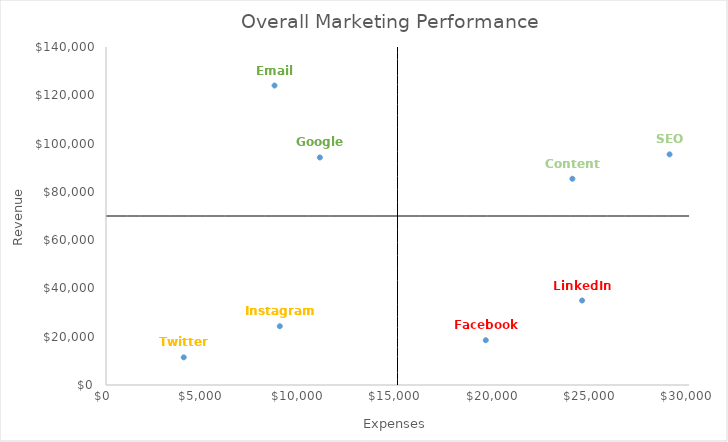
| Category | Series 0 |
|---|---|
| 29000.0 | 95523 |
| 8673.0 | 124045 |
| 11004.0 | 94245 |
| 19543.0 | 18543 |
| 8943.0 | 24345 |
| 24000.0 | 85434 |
| 24500.0 | 35000 |
| 4000.0 | 11453 |